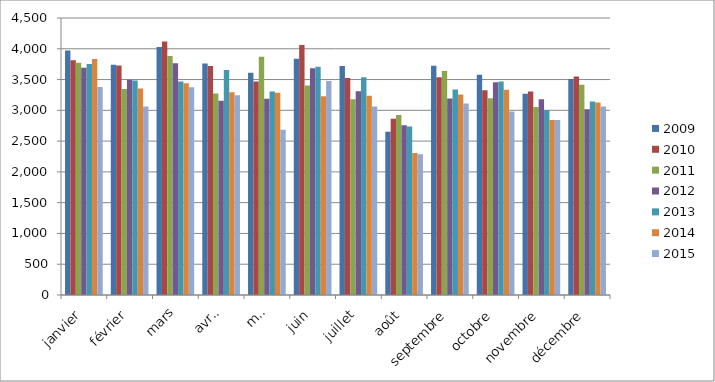
| Category | 2009 | 2010 | 2011 | 2012 | 2013 | 2014 | 2015 |
|---|---|---|---|---|---|---|---|
| janvier | 3972 | 3814 | 3772 | 3692 | 3752 | 3834 | 3380 |
| février | 3740 | 3730 | 3347 | 3496 | 3484 | 3356 | 3063 |
| mars | 4027 | 4119 | 3883 | 3766 | 3468 | 3442 | 3374 |
| avril | 3762 | 3719 | 3272 | 3157 | 3657 | 3294 | 3247 |
| mai | 3612 | 3470 | 3870 | 3188 | 3307 | 3284 | 2685 |
| juin | 3836 | 4060 | 3402 | 3682 | 3708 | 3229 | 3476 |
| juillet | 3722 | 3524 | 3179 | 3311 | 3537 | 3236 | 3064 |
| août | 2652 | 2864 | 2923 | 2757 | 2739 | 2308 | 2285 |
| septembre | 3726 | 3538 | 3639 | 3192 | 3338 | 3257 | 3109 |
| octobre | 3579 | 3325 | 3198 | 3455 | 3469 | 3334 | 2982 |
| novembre | 3269 | 3304 | 3055 | 3179 | 3007 | 2844 | 2844 |
| décembre | 3510 | 3550 | 3417 | 3017 | 3144 | 3128 | 3063 |